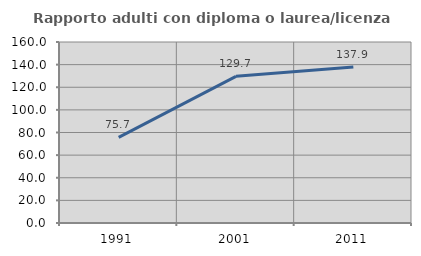
| Category | Rapporto adulti con diploma o laurea/licenza media  |
|---|---|
| 1991.0 | 75.676 |
| 2001.0 | 129.682 |
| 2011.0 | 137.853 |